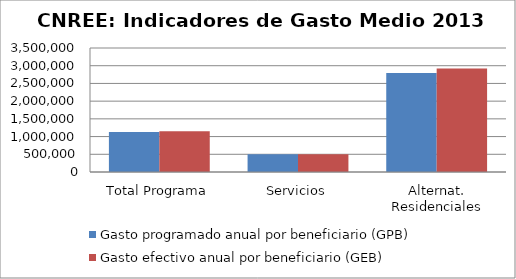
| Category | Gasto programado anual por beneficiario (GPB)  | Gasto efectivo anual por beneficiario (GEB)  |
|---|---|---|
| Total Programa | 1129233.239 | 1149492.532 |
| Servicios | 500796.248 | 498498.711 |
| Alternat. Residenciales | 2792629.41 | 2920358.812 |